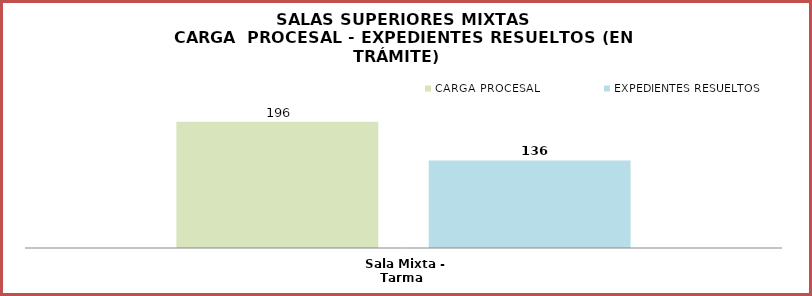
| Category | CARGA PROCESAL | EXPEDIENTES RESUELTOS |
|---|---|---|
| Sala Mixta - Tarma | 196 | 136 |